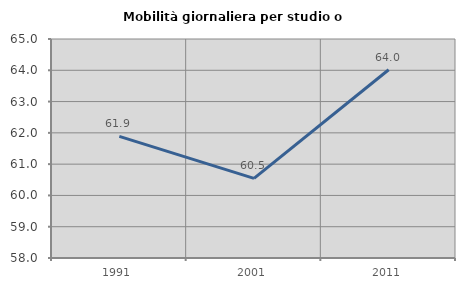
| Category | Mobilità giornaliera per studio o lavoro |
|---|---|
| 1991.0 | 61.887 |
| 2001.0 | 60.544 |
| 2011.0 | 64.016 |